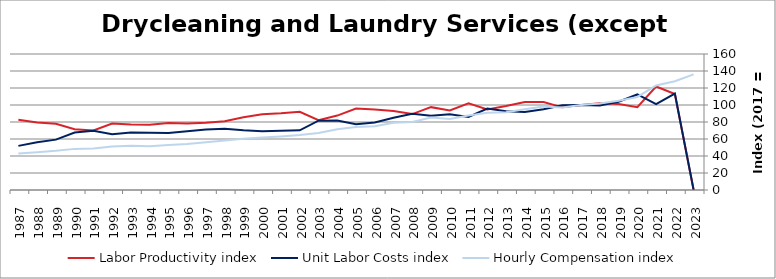
| Category | Labor Productivity index | Unit Labor Costs index | Hourly Compensation index |
|---|---|---|---|
| 2023.0 | 0 | 0 | 136.037 |
| 2022.0 | 112.875 | 113.382 | 127.98 |
| 2021.0 | 121.741 | 100.977 | 122.931 |
| 2020.0 | 97.404 | 112.393 | 109.476 |
| 2019.0 | 101.149 | 103.88 | 105.074 |
| 2018.0 | 102.084 | 99.558 | 101.633 |
| 2017.0 | 100 | 100 | 100 |
| 2016.0 | 97.233 | 99.698 | 96.94 |
| 2015.0 | 103.536 | 94.909 | 98.265 |
| 2014.0 | 103.57 | 91.645 | 94.917 |
| 2013.0 | 98.753 | 92.723 | 91.566 |
| 2012.0 | 94.842 | 95.727 | 90.79 |
| 2011.0 | 102.087 | 85.883 | 87.675 |
| 2010.0 | 93.557 | 89.182 | 83.436 |
| 2009.0 | 97.467 | 87.399 | 85.185 |
| 2008.0 | 89.316 | 89.712 | 80.127 |
| 2007.0 | 92.85 | 85.086 | 79.002 |
| 2006.0 | 94.577 | 79.441 | 75.133 |
| 2005.0 | 95.86 | 77.331 | 74.13 |
| 2004.0 | 87.536 | 81.721 | 71.535 |
| 2003.0 | 82.194 | 81.571 | 67.047 |
| 2002.0 | 92.036 | 70.251 | 64.656 |
| 2001.0 | 90.283 | 69.802 | 63.019 |
| 2000.0 | 89.125 | 69.208 | 61.681 |
| 1999.0 | 85.687 | 70.302 | 60.24 |
| 1998.0 | 80.927 | 71.97 | 58.243 |
| 1997.0 | 78.979 | 71.233 | 56.259 |
| 1996.0 | 78.107 | 69.26 | 54.097 |
| 1995.0 | 78.932 | 66.92 | 52.822 |
| 1994.0 | 76.668 | 67.31 | 51.605 |
| 1993.0 | 77.096 | 67.665 | 52.167 |
| 1992.0 | 78.183 | 65.474 | 51.19 |
| 1991.0 | 70.137 | 69.814 | 48.965 |
| 1990.0 | 71.594 | 67.574 | 48.379 |
| 1989.0 | 77.84 | 59.256 | 46.125 |
| 1988.0 | 79.337 | 56.153 | 44.55 |
| 1987.0 | 82.661 | 51.896 | 42.897 |